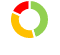
| Category | Series 0 |
|---|---|
| 0 | 5 |
| 1 | 4 |
| 2 | 2 |